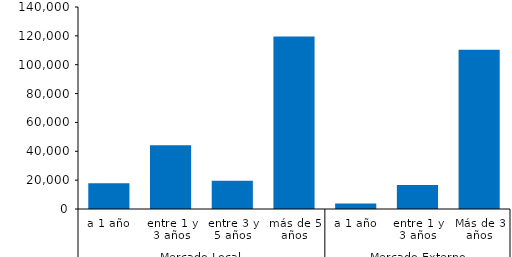
| Category | II |
|---|---|
| 0 | 17840.772 |
| 1 | 44244.607 |
| 2 | 19500.893 |
| 3 | 119476.498 |
| 4 | 3865.945 |
| 5 | 16643.421 |
| 6 | 110366.249 |